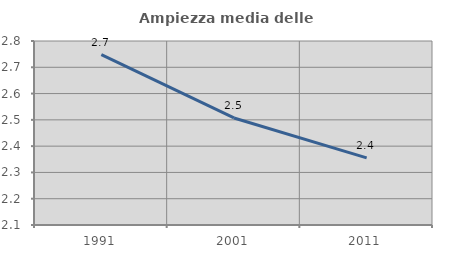
| Category | Ampiezza media delle famiglie |
|---|---|
| 1991.0 | 2.748 |
| 2001.0 | 2.507 |
| 2011.0 | 2.355 |